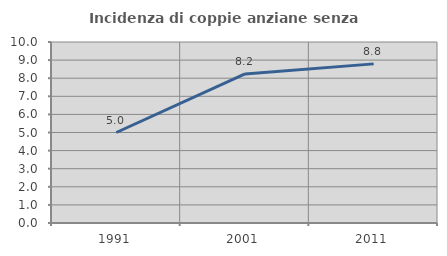
| Category | Incidenza di coppie anziane senza figli  |
|---|---|
| 1991.0 | 5 |
| 2001.0 | 8.235 |
| 2011.0 | 8.791 |